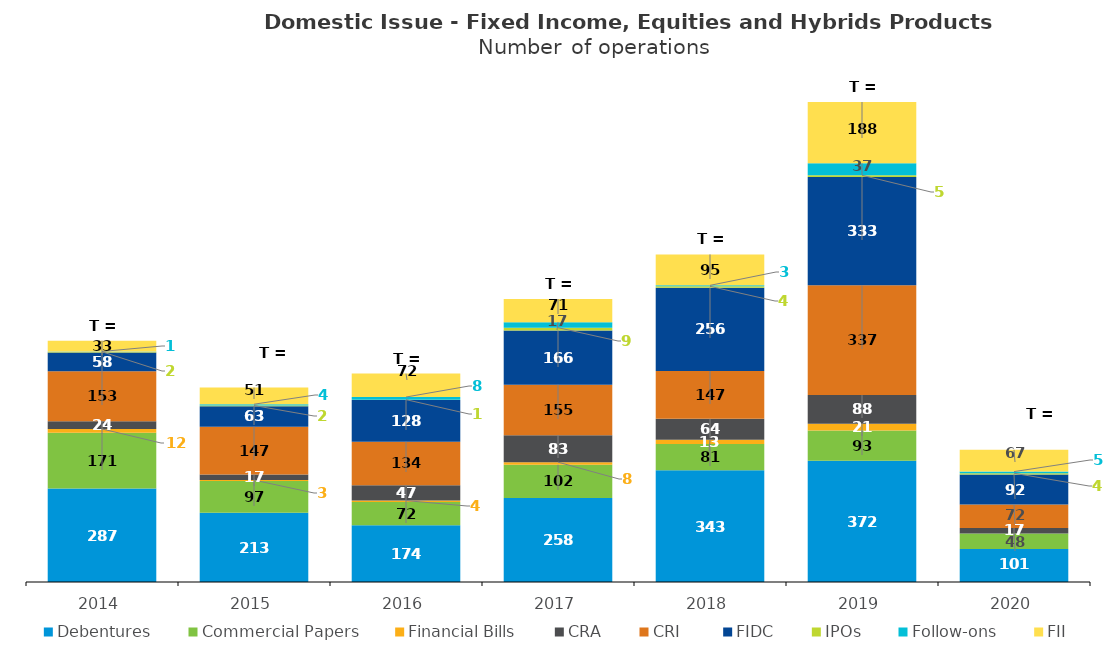
| Category | Debentures | Commercial Papers | Financial Bills | CRA | CRI  | FIDC | IPOs | Follow-ons | FII |
|---|---|---|---|---|---|---|---|---|---|
| 2014.0 | 287 | 171 | 12 | 24 | 153 | 58 | 2 | 1 | 33 |
| 2015.0 | 213 | 97 | 3 | 17 | 147 | 63 | 2 | 4 | 51 |
| 2016.0 | 174 | 72 | 4 | 47 | 134 | 128 | 1 | 8 | 72 |
| 2017.0 | 258 | 102 | 8 | 83 | 155 | 166 | 9 | 17 | 71 |
| 2018.0 | 343 | 81 | 13 | 64 | 147 | 256 | 4 | 3 | 95 |
| 2019.0 | 372 | 93 | 21 | 88 | 337 | 333 | 5 | 37 | 188 |
| 2020.0 | 101 | 48 | 0 | 17 | 72 | 92 | 4 | 5 | 67 |